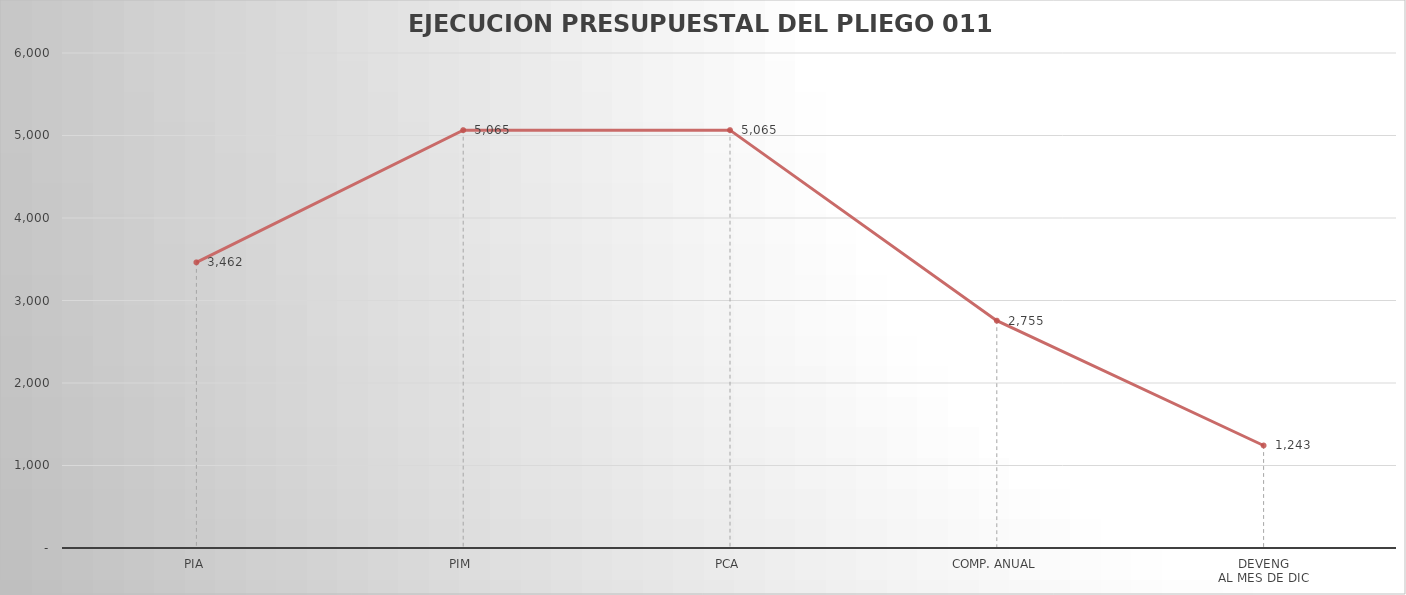
| Category | Series 0 |
|---|---|
| PIA | 3462.391 |
| PIM | 5064.967 |
| PCA | 5064.967 |
| COMP. ANUAL | 2755.459 |
| DEVENG
AL MES DE DIC | 1242.551 |